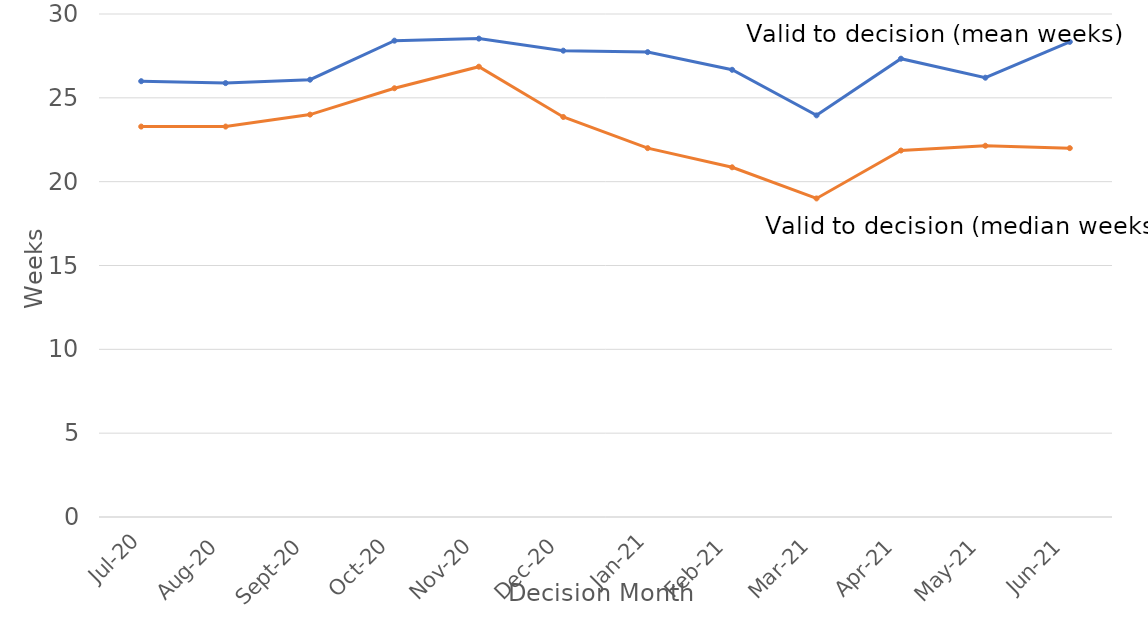
| Category | Valid to Decision  (mean weeks) | Valid to Decision  (median weeks) |
|---|---|---|
| 2020-07-01 | 25.992 | 23.286 |
| 2020-08-01 | 25.879 | 23.286 |
| 2020-09-01 | 26.082 | 24 |
| 2020-10-01 | 28.41 | 25.571 |
| 2020-11-01 | 28.531 | 26.857 |
| 2020-12-01 | 27.813 | 23.857 |
| 2021-01-01 | 27.727 | 22 |
| 2021-02-01 | 26.673 | 20.857 |
| 2021-03-01 | 23.954 | 19 |
| 2021-04-01 | 27.335 | 21.857 |
| 2021-05-01 | 26.201 | 22.143 |
| 2021-06-01 | 28.337 | 22 |